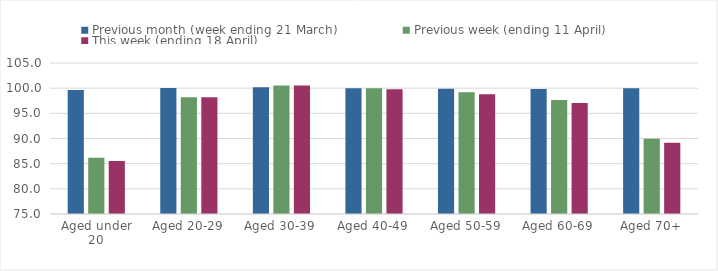
| Category | Previous month (week ending 21 March) | Previous week (ending 11 April) | This week (ending 18 April) |
|---|---|---|---|
| Aged under 20 | 99.631 | 86.171 | 85.525 |
| Aged 20-29 | 100.021 | 98.183 | 98.188 |
| Aged 30-39 | 100.169 | 100.515 | 100.538 |
| Aged 40-49 | 99.991 | 99.997 | 99.807 |
| Aged 50-59 | 99.866 | 99.195 | 98.816 |
| Aged 60-69 | 99.816 | 97.648 | 97.052 |
| Aged 70+ | 99.97 | 89.95 | 89.144 |